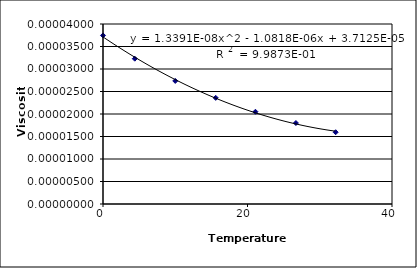
| Category | Series 0 |
|---|---|
| 0.0 | 0 |
| 4.4 | 0 |
| 10.0 | 0 |
| 15.6 | 0 |
| 21.1 | 0 |
| 26.7 | 0 |
| 32.2 | 0 |